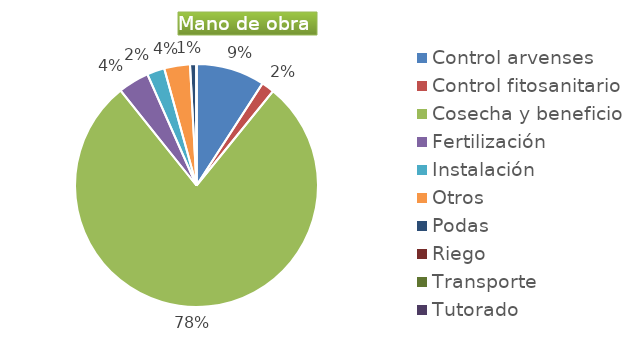
| Category | Series 0 |
|---|---|
| Control arvenses | 10266704 |
| Control fitosanitario | 1925010 |
| Cosecha y beneficio | 88158141 |
| Fertilización | 4620024 |
| Instalación | 2630847 |
| Otros | 3850020 |
| Podas | 962505 |
| Riego | 0 |
| Transporte | 0 |
| Tutorado | 0 |